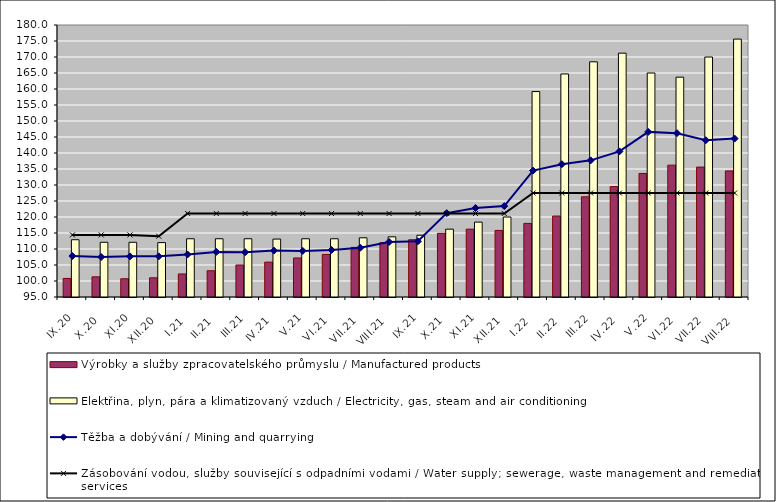
| Category | Výrobky a služby zpracovatelského průmyslu / Manufactured products | Elektřina, plyn, pára a klimatizovaný vzduch / Electricity, gas, steam and air conditioning |
|---|---|---|
| IX.20 | 100.8 | 112.9 |
| X.20 | 101.3 | 112.1 |
| XI.20 | 100.7 | 112.1 |
| XII.20 | 101 | 112 |
| I.21 | 102.2 | 113.2 |
| II.21 | 103.2 | 113.2 |
| III.21 | 105 | 113.2 |
| IV.21 | 105.9 | 113.1 |
| V.21 | 107.2 | 113.2 |
| VI.21 | 108.3 | 113.2 |
| VII.21 | 110.5 | 113.5 |
| VIII.21 | 112 | 113.8 |
| IX.21 | 112.9 | 114.3 |
| X.21 | 114.9 | 116.2 |
| XI.21 | 116.2 | 118.4 |
| XII.21 | 115.8 | 120 |
| I.22 | 118 | 159.2 |
| II.22 | 120.3 | 164.7 |
| III.22 | 126.3 | 168.5 |
| IV.22 | 129.5 | 171.2 |
| V.22 | 133.6 | 165 |
| VI.22 | 136.2 | 163.7 |
| VII.22 | 135.6 | 170 |
| VIII.22 | 134.4 | 175.6 |